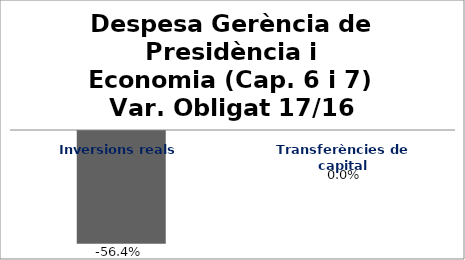
| Category | Series 0 |
|---|---|
| Inversions reals | -0.564 |
| Transferències de capital | 0 |